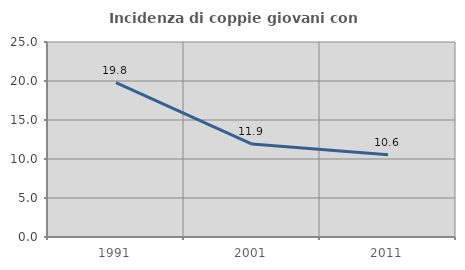
| Category | Incidenza di coppie giovani con figli |
|---|---|
| 1991.0 | 19.799 |
| 2001.0 | 11.912 |
| 2011.0 | 10.559 |